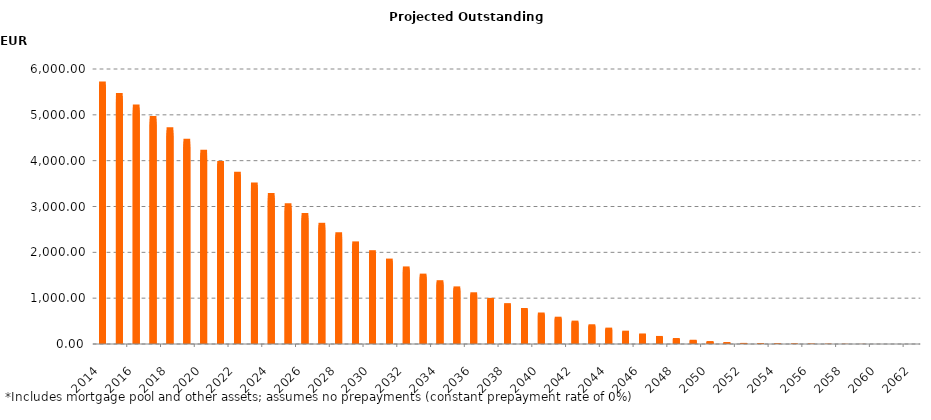
| Category | Series 1 |
|---|---|
| 2014-03-31 | 5726351084.24 |
| 2014-06-30 | 5663480917.67 |
| 2014-09-30 | 5600743307.63 |
| 2014-12-31 | 5538065792.6 |
| 2015-03-31 | 5475422006.1 |
| 2015-06-30 | 5412805120.9 |
| 2015-09-30 | 5350212811.65 |
| 2015-12-31 | 5287623033.64 |
| 2016-03-31 | 5225080440.87 |
| 2016-06-30 | 5162577017.18 |
| 2016-09-30 | 5100104837.35 |
| 2016-12-31 | 5037659731.7 |
| 2017-03-31 | 4975337665.3 |
| 2017-06-30 | 4913121897.72 |
| 2017-09-30 | 4850952768.01 |
| 2017-12-31 | 4788837915.53 |
| 2018-03-31 | 4726795279.65 |
| 2018-06-30 | 4664832388.44 |
| 2018-09-30 | 4603004460.55 |
| 2018-12-31 | 4541353542.19 |
| 2019-03-31 | 4479853772.47 |
| 2019-06-30 | 4418531065.17 |
| 2019-09-30 | 4357428038.49 |
| 2019-12-31 | 4296519535.73 |
| 2020-03-31 | 4235780469.42 |
| 2020-06-30 | 4175272839.74 |
| 2020-09-30 | 4114969996.61 |
| 2020-12-31 | 4054881759.19 |
| 2021-03-31 | 3994985654.72 |
| 2021-06-30 | 3935264892.36 |
| 2021-09-30 | 3875785961.17 |
| 2021-12-31 | 3816503287.53 |
| 2022-03-31 | 3757427239.94 |
| 2022-06-30 | 3698604146.69 |
| 2022-09-30 | 3640088321.04 |
| 2022-12-31 | 3581893344.43 |
| 2023-03-31 | 3524004599.25 |
| 2023-06-30 | 3466434428.44 |
| 2023-09-30 | 3409173755.68 |
| 2023-12-31 | 3352310688.56 |
| 2024-03-31 | 3295781111.58 |
| 2024-06-30 | 3239598797.6 |
| 2024-09-30 | 3183696254.81 |
| 2024-12-31 | 3128175846.76 |
| 2025-03-31 | 3073020229.11 |
| 2025-06-30 | 3018245078.92 |
| 2025-09-30 | 2963842897.87 |
| 2025-12-31 | 2909821340.26 |
| 2026-03-31 | 2856132777.3 |
| 2026-06-30 | 2802751940.53 |
| 2026-09-30 | 2749653638.17 |
| 2026-12-31 | 2696915037.68 |
| 2027-03-31 | 2644526709.46 |
| 2027-06-30 | 2592423185.09 |
| 2027-09-30 | 2540680929.24 |
| 2027-12-31 | 2489305936.9 |
| 2028-03-31 | 2438332075.46 |
| 2028-06-30 | 2387707424.29 |
| 2028-09-30 | 2337478949.72 |
| 2028-12-31 | 2287850094.48 |
| 2029-03-31 | 2238686535.62 |
| 2029-06-30 | 2189955891.45 |
| 2029-09-30 | 2141664058.95 |
| 2029-12-31 | 2093931708.04 |
| 2030-03-31 | 2046622892.05 |
| 2030-06-30 | 1999883035.42 |
| 2030-09-30 | 1953735806.66 |
| 2030-12-31 | 1908295913.9 |
| 2031-03-31 | 1863551394.82 |
| 2031-06-30 | 1819590391.67 |
| 2031-09-30 | 1776446112.99 |
| 2031-12-31 | 1734159612.94 |
| 2032-03-31 | 1692639684.86 |
| 2032-06-30 | 1651817340.59 |
| 2032-09-30 | 1611860781.6 |
| 2032-12-31 | 1573093976.47 |
| 2033-03-31 | 1535596472.45 |
| 2033-06-30 | 1498800618.2 |
| 2033-09-30 | 1462594841.69 |
| 2033-12-31 | 1427059882.69 |
| 2034-03-31 | 1392096052.82 |
| 2034-06-30 | 1357627540.73 |
| 2034-09-30 | 1323619442.79 |
| 2034-12-31 | 1290074510.98 |
| 2035-03-31 | 1256903565.71 |
| 2035-06-30 | 1224140444.75 |
| 2035-09-30 | 1191763903.7 |
| 2035-12-31 | 1159857411.09 |
| 2036-03-31 | 1128321982.71 |
| 2036-06-30 | 1097205294.98 |
| 2036-09-30 | 1066505800.34 |
| 2036-12-31 | 1036263048.74 |
| 2037-03-31 | 1006440138.07 |
| 2037-06-30 | 977022726.73 |
| 2037-09-30 | 948076928.44 |
| 2037-12-31 | 919689190.98 |
| 2038-03-31 | 891807044.62 |
| 2038-06-30 | 864459457.37 |
| 2038-09-30 | 837683678.55 |
| 2038-12-31 | 811494390.83 |
| 2039-03-31 | 785784788.19 |
| 2039-06-30 | 760507669.97 |
| 2039-09-30 | 735677518.39 |
| 2039-12-31 | 711328826.75 |
| 2040-03-31 | 687352402.91 |
| 2040-06-30 | 663793999.45 |
| 2040-09-30 | 640643538.51 |
| 2040-12-31 | 617983597.91 |
| 2041-03-31 | 595669727.18 |
| 2041-06-30 | 573720893.42 |
| 2041-09-30 | 552148587.03 |
| 2041-12-31 | 530991132.84 |
| 2042-03-31 | 510167456.48 |
| 2042-06-30 | 489681881.16 |
| 2042-09-30 | 469580745.22 |
| 2042-12-31 | 449932010 |
| 2043-03-31 | 430638676.07 |
| 2043-06-30 | 411737971.42 |
| 2043-09-30 | 393271681.55 |
| 2043-12-31 | 375312805.29 |
| 2044-03-31 | 357708059.67 |
| 2044-06-30 | 340482599.03 |
| 2044-09-30 | 323593139.59 |
| 2044-12-31 | 307103113.76 |
| 2045-03-31 | 290958034.24 |
| 2045-06-30 | 275133421.37 |
| 2045-09-30 | 259642695.53 |
| 2045-12-31 | 244590407.42 |
| 2046-03-31 | 229913548.34 |
| 2046-06-30 | 215650769.38 |
| 2046-09-30 | 201844105.1 |
| 2046-12-31 | 188573970.8 |
| 2047-03-31 | 175805622.68 |
| 2047-06-30 | 163527372.43 |
| 2047-09-30 | 151793036.27 |
| 2047-12-31 | 140699836.08 |
| 2048-03-31 | 130107848.17 |
| 2048-06-30 | 120050202.87 |
| 2048-09-30 | 110488952.35 |
| 2048-12-31 | 101460793.27 |
| 2049-03-31 | 92783727.19 |
| 2049-06-30 | 84416282.3 |
| 2049-09-30 | 76467091.21 |
| 2049-12-31 | 68988498.25 |
| 2050-03-31 | 61966883.37 |
| 2050-06-30 | 55435536.29 |
| 2050-09-30 | 49424756.56 |
| 2050-12-31 | 44071898.87 |
| 2051-03-31 | 39261168.23 |
| 2051-06-30 | 34955421.19 |
| 2051-09-30 | 31061138.72 |
| 2051-12-31 | 27529247.49 |
| 2052-03-31 | 24278779.07 |
| 2052-06-30 | 21369833.52 |
| 2052-09-30 | 18757537.71 |
| 2052-12-31 | 16537463.39 |
| 2053-03-31 | 14672816.69 |
| 2053-06-30 | 13130053.84 |
| 2053-09-30 | 11887808.83 |
| 2053-12-31 | 10939862.09 |
| 2054-03-31 | 10156611.4 |
| 2054-06-30 | 9432111.03 |
| 2054-09-30 | 8745979.06 |
| 2054-12-31 | 8082693.71 |
| 2055-03-31 | 7453465.53 |
| 2055-06-30 | 6850031.64 |
| 2055-09-30 | 6281757.12 |
| 2055-12-31 | 5738569.33 |
| 2056-03-31 | 5221533.57 |
| 2056-06-30 | 4733633.02 |
| 2056-09-30 | 4284158.11 |
| 2056-12-31 | 3857015.46 |
| 2057-03-31 | 3469047.41 |
| 2057-06-30 | 3102828.02 |
| 2057-09-30 | 2759594.82 |
| 2057-12-31 | 2457346.14 |
| 2058-03-31 | 2182581.81 |
| 2058-06-30 | 1937570.55 |
| 2058-09-30 | 1713596.28 |
| 2058-12-31 | 1507981.21 |
| 2059-03-31 | 1323690.42 |
| 2059-06-30 | 1154802.29 |
| 2059-09-30 | 991344.28 |
| 2059-12-31 | 843080.1 |
| 2060-03-31 | 709330.63 |
| 2060-06-30 | 588522.18 |
| 2060-09-30 | 481147.16 |
| 2060-12-31 | 388623.9 |
| 2061-03-31 | 306317.88 |
| 2061-06-30 | 238146.28 |
| 2061-09-30 | 183640.22 |
| 2061-12-31 | 145643.27 |
| 2062-03-31 | 112329.11 |
| 2062-06-30 | 82756.81 |
| 2062-09-30 | 59157.22 |
| 2062-12-31 | 38474.5 |
| 2063-03-31 | 21908.21 |
| 2063-06-30 | 11043.44 |
| 2063-09-30 | 3172.23 |